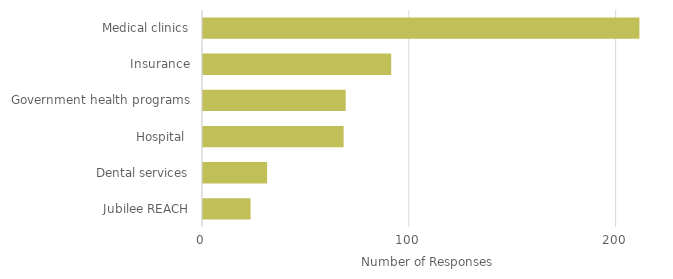
| Category | Series 0 |
|---|---|
| Jubilee REACH | 23 |
| Dental services | 31 |
| Hospital  | 68 |
| Government health programs | 69 |
| Insurance | 91 |
| Medical clinics | 211 |